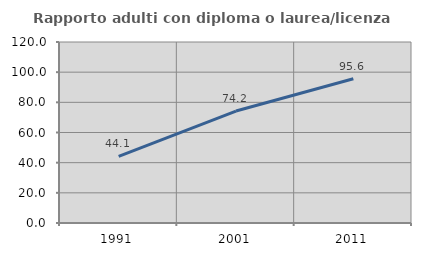
| Category | Rapporto adulti con diploma o laurea/licenza media  |
|---|---|
| 1991.0 | 44.118 |
| 2001.0 | 74.238 |
| 2011.0 | 95.6 |